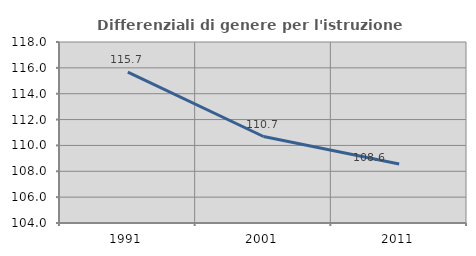
| Category | Differenziali di genere per l'istruzione superiore |
|---|---|
| 1991.0 | 115.674 |
| 2001.0 | 110.69 |
| 2011.0 | 108.56 |